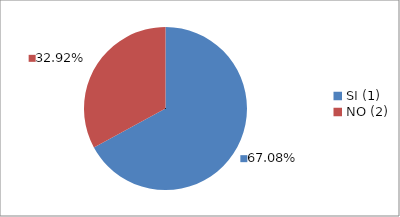
| Category | Series 0 |
|---|---|
| SI (1) | 0.671 |
| NO (2) | 0.329 |